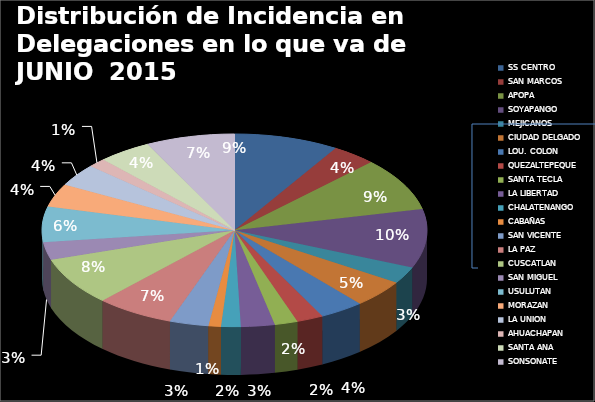
| Category | Series 0 | Series 1 |
|---|---|---|
| SS CENTRO | 0.088 |  |
| SAN MARCOS | 0.037 |  |
| APOPA | 0.089 |  |
| SOYAPANGO | 0.098 |  |
| MEJICANOS | 0.028 |  |
| CIUDAD DELGADO | 0.046 |  |
| LOU. COLON | 0.037 |  |
| QUEZALTEPEQUE | 0.022 |  |
| SANTA TECLA | 0.019 |  |
| LA LIBERTAD | 0.028 |  |
| CHALATENANGO | 0.016 |  |
| CABAÑAS | 0.01 |  |
| SAN VICENTE | 0.033 |  |
| LA PAZ | 0.066 |  |
| CUSCATLAN | 0.08 |  |
| SAN MIGUEL | 0.03 |  |
| USULUTAN | 0.06 |  |
| MORAZAN | 0.039 |  |
| LA UNION | 0.037 |  |
| AHUACHAPAN | 0.015 |  |
| SANTA ANA | 0.045 |  |
| SONSONATE | 0.075 |  |